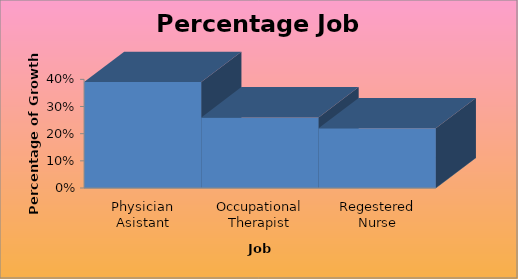
| Category | Series 0 |
|---|---|
| Physician Asistant | 0.39 |
| Occupational Therapist | 0.26 |
| Regestered Nurse | 0.22 |